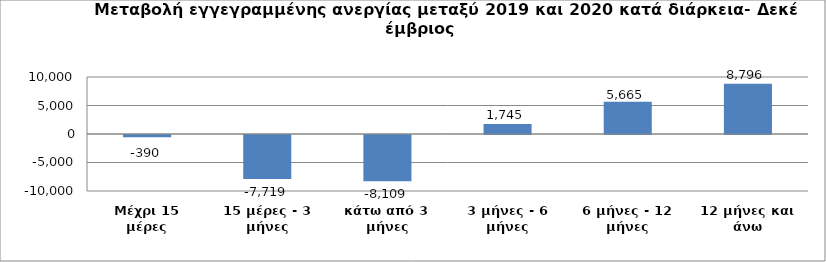
| Category | Series 0 |
|---|---|
| Μέχρι 15 μέρες | -390 |
| 15 μέρες - 3 μήνες | -7719 |
| κάτω από 3 μήνες | -8109 |
| 3 μήνες - 6 μήνες | 1745 |
| 6 μήνες - 12 μήνες | 5665 |
| 12 μήνες και άνω | 8796 |